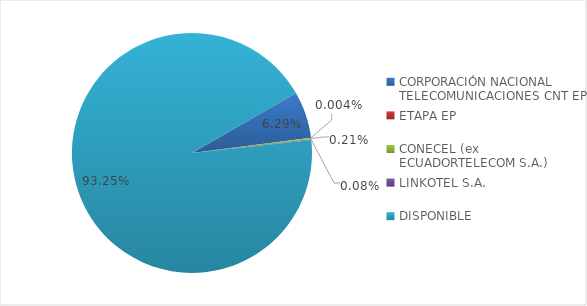
| Category | CÓDIGO DE ÁREA 3 |
|---|---|
| CORPORACIÓN NACIONAL TELECOMUNICACIONES CNT EP | 0.063 |
| ETAPA EP | 0 |
| CONECEL (ex ECUADORTELECOM S.A.) | 0.002 |
| LINKOTEL S.A. | 0.001 |
| DISPONIBLE | 0.933 |